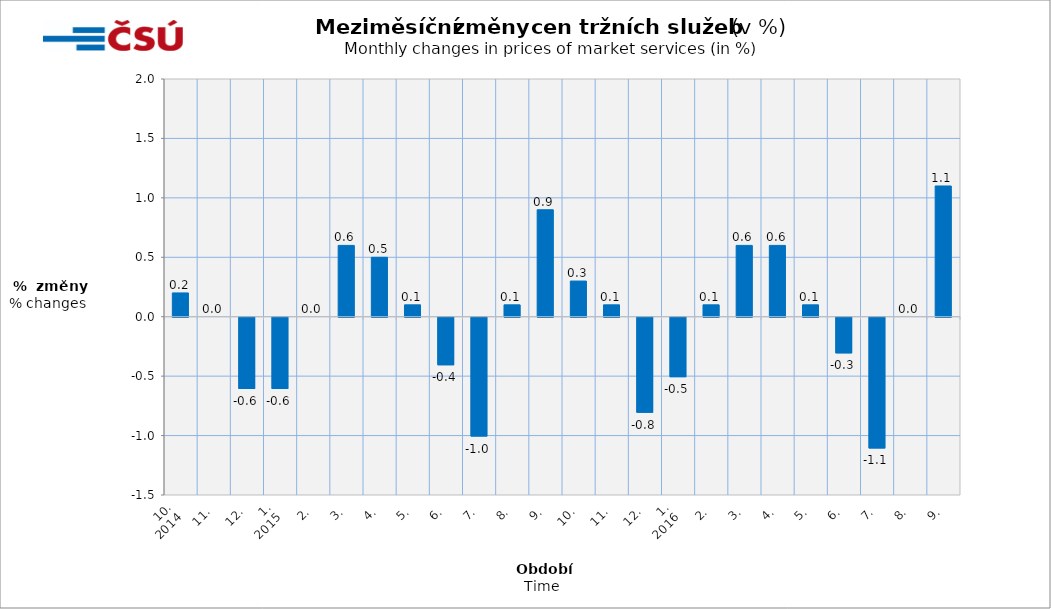
| Category | Meziměsíční změny v % |
|---|---|
| 0 | 0.2 |
| 1 | 0 |
| 2 | -0.6 |
| 3 | -0.6 |
| 4 | 0 |
| 5 | 0.6 |
| 6 | 0.5 |
| 7 | 0.1 |
| 8 | -0.4 |
| 9 | -1 |
| 10 | 0.1 |
| 11 | 0.9 |
| 12 | 0.3 |
| 13 | 0.1 |
| 14 | -0.8 |
| 15 | -0.5 |
| 16 | 0.1 |
| 17 | 0.6 |
| 18 | 0.6 |
| 19 | 0.1 |
| 20 | -0.3 |
| 21 | -1.1 |
| 22 | 0 |
| 23 | 1.1 |